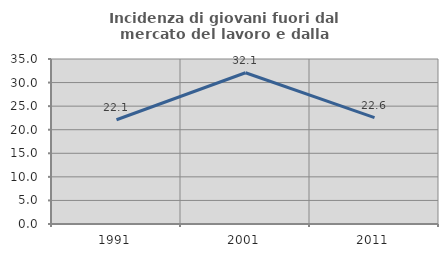
| Category | Incidenza di giovani fuori dal mercato del lavoro e dalla formazione  |
|---|---|
| 1991.0 | 22.117 |
| 2001.0 | 32.079 |
| 2011.0 | 22.552 |